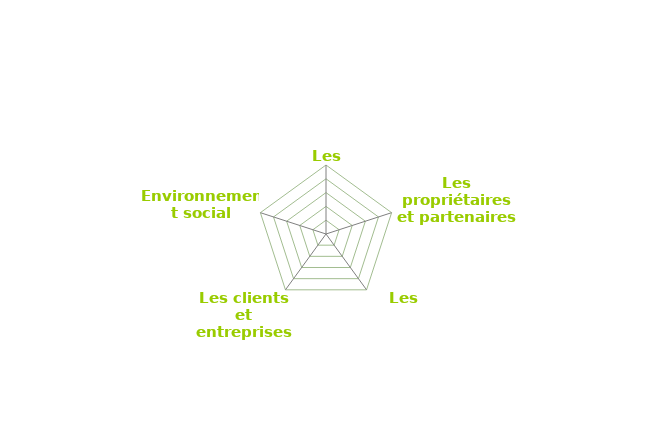
| Category | Series 0 |
|---|---|
| Les fournisseurs | 0 |
| Les propriétaires et partenaires financiers | 0 |
| Les salariés | 0 |
| Les clients et entreprises partenaires | 0 |
| Environnement social | 0 |